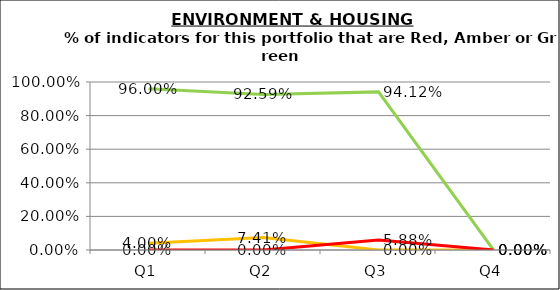
| Category | Green | Amber | Red |
|---|---|---|---|
| Q1 | 0.96 | 0.04 | 0 |
| Q2 | 0.926 | 0.074 | 0 |
| Q3 | 0.941 | 0 | 0.059 |
| Q4 | 0 | 0 | 0 |